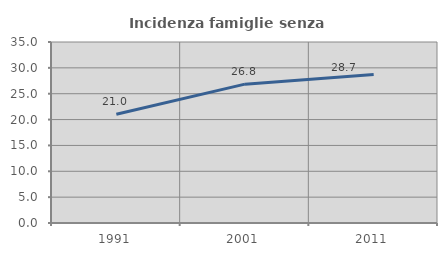
| Category | Incidenza famiglie senza nuclei |
|---|---|
| 1991.0 | 21.04 |
| 2001.0 | 26.849 |
| 2011.0 | 28.713 |